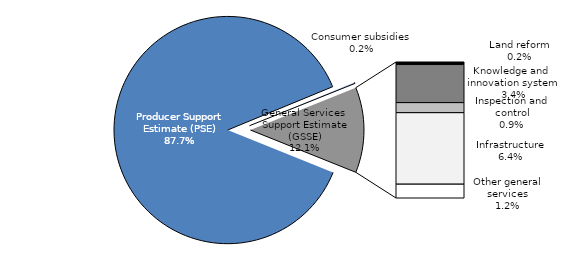
| Category | Billion KRW |
|---|---|
| Producer Support Estimate (PSE) | 23047.43 |
| Consumer subsidies | 40.436 |
| Land reform | 60.161 |
| Knowledge and 
innovation system | 893.743 |
| Inspection and control | 236.199 |
| Infrastructure | 1678.351 |
| Other general services | 324.269 |